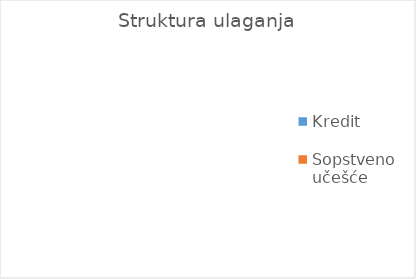
| Category | Series 0 |
|---|---|
| Kredit | 0 |
| Sopstveno učešće | 0 |